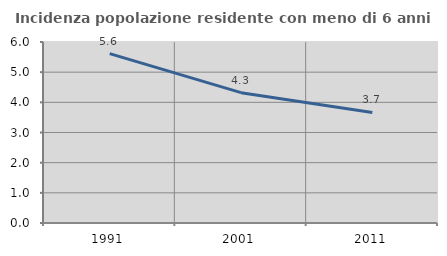
| Category | Incidenza popolazione residente con meno di 6 anni |
|---|---|
| 1991.0 | 5.616 |
| 2001.0 | 4.32 |
| 2011.0 | 3.665 |